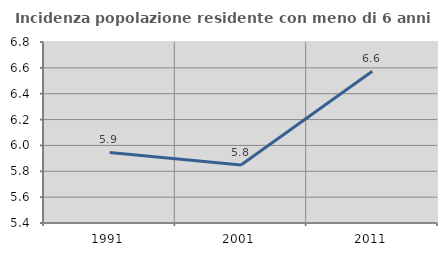
| Category | Incidenza popolazione residente con meno di 6 anni |
|---|---|
| 1991.0 | 5.945 |
| 2001.0 | 5.849 |
| 2011.0 | 6.574 |